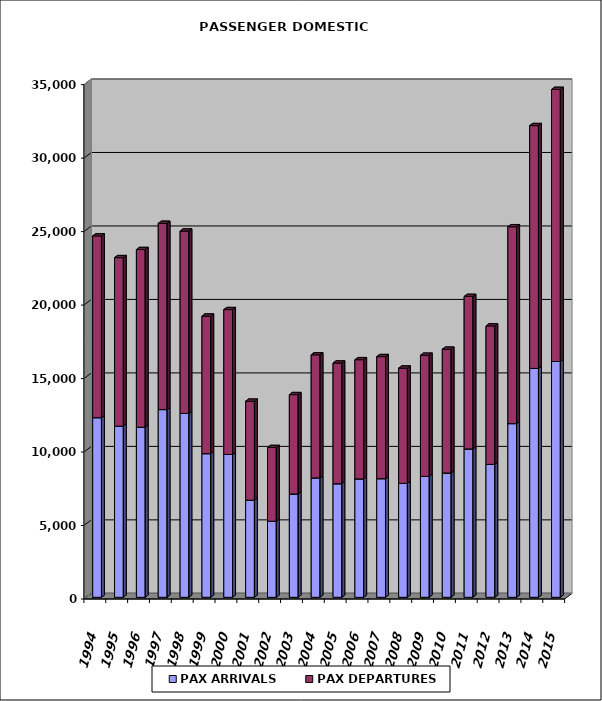
| Category | PAX ARRIVALS | PAX DEPARTURES |
|---|---|---|
| 1994.0 | 12224 | 12368 |
| 1995.0 | 11644 | 11468 |
| 1996.0 | 11571 | 12093 |
| 1997.0 | 12774 | 12674 |
| 1998.0 | 12514 | 12407 |
| 1999.0 | 9775 | 9359 |
| 2000.0 | 9723 | 9854 |
| 2001.0 | 6607 | 6736 |
| 2002.0 | 5177 | 5015 |
| 2003.0 | 7029 | 6762 |
| 2004.0 | 8124 | 8378 |
| 2005.0 | 7728 | 8210 |
| 2006.0 | 8057 | 8111 |
| 2007.0 | 8072 | 8305 |
| 2008.0 | 7752 | 7843 |
| 2009.0 | 8231 | 8239 |
| 2010.0 | 8458 | 8422 |
| 2011.0 | 10095 | 10378 |
| 2012.0 | 9046 | 9419 |
| 2013.0 | 11819 | 13397 |
| 2014.0 | 15575 | 16522 |
| 2015.0 | 16048 | 18512 |